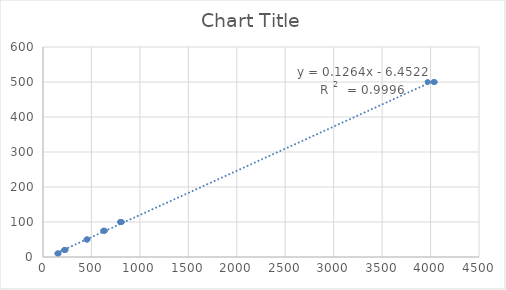
| Category | Series 0 |
|---|---|
| 161.0 | 10 |
| 148.0 | 10 |
| 155.0 | 10 |
| 233.0 | 20 |
| 224.0 | 20 |
| 217.0 | 20 |
| 455.0 | 50 |
| 459.0 | 50 |
| 448.0 | 50 |
| 629.0 | 75 |
| 639.0 | 75 |
| 621.0 | 75 |
| 795.0 | 100 |
| 814.0 | 100 |
| 799.0 | 100 |
| 4043.0 | 500 |
| 4031.0 | 500 |
| 3970.0 | 500 |